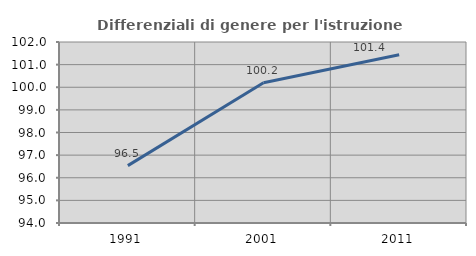
| Category | Differenziali di genere per l'istruzione superiore |
|---|---|
| 1991.0 | 96.535 |
| 2001.0 | 100.2 |
| 2011.0 | 101.433 |